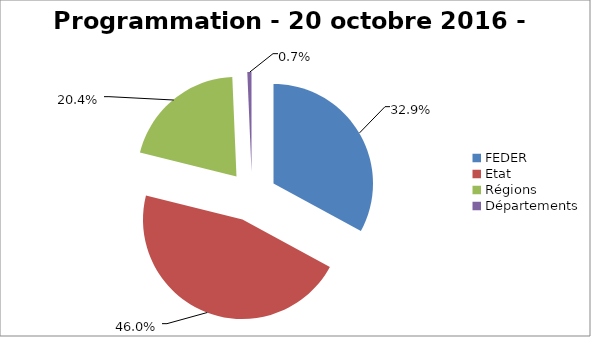
| Category | Series 0 |
|---|---|
| FEDER | 1782249.462 |
| Etat | 2487100.793 |
| Régions | 1105809.79 |
| Départements | 36479.63 |